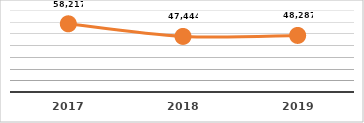
| Category | PERSONAS CAPACITADAS |
|---|---|
| 2017.0 | 58217 |
| 2018.0 | 47444 |
| 2019.0 | 48287 |